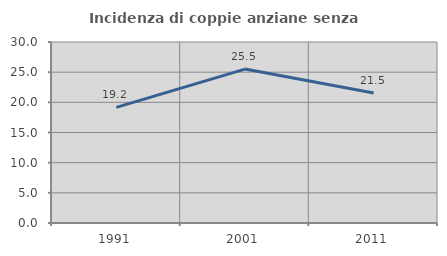
| Category | Incidenza di coppie anziane senza figli  |
|---|---|
| 1991.0 | 19.156 |
| 2001.0 | 25.514 |
| 2011.0 | 21.538 |